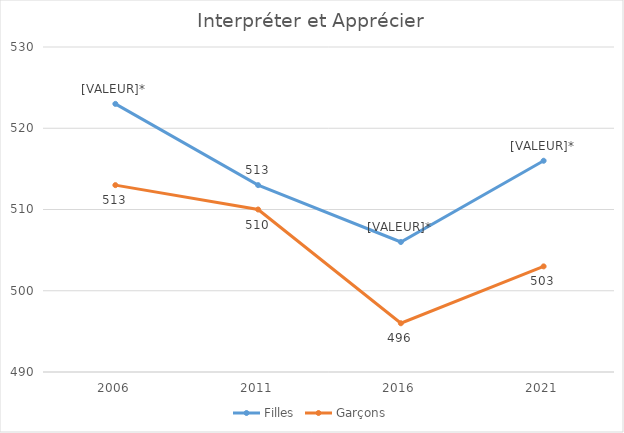
| Category | Filles | Garçons |
|---|---|---|
| 2006.0 | 523 | 513 |
| 2011.0 | 513 | 510 |
| 2016.0 | 506 | 496 |
| 2021.0 | 516 | 503 |